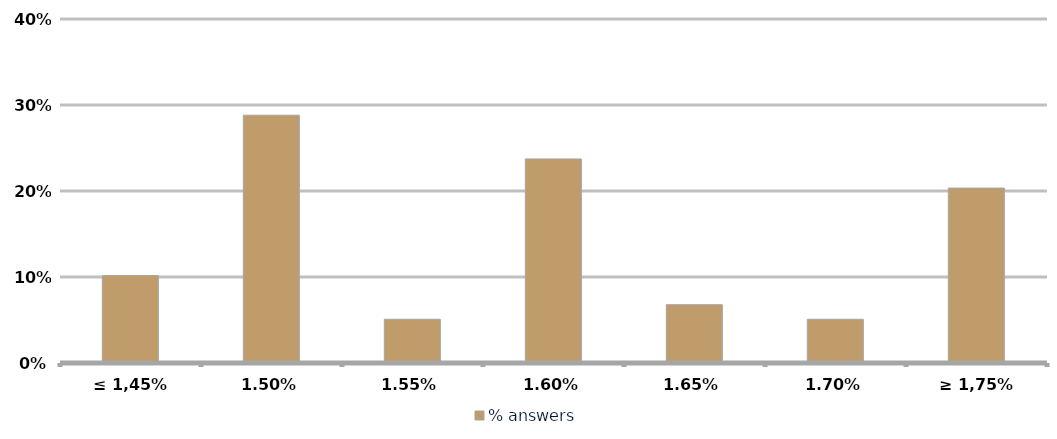
| Category | % answers |
|---|---|
| ≤ 1,45% | 0.102 |
| 1,50% | 0.288 |
| 1,55% | 0.051 |
| 1,60% | 0.237 |
| 1,65% | 0.068 |
| 1,70% | 0.051 |
| ≥ 1,75% | 0.203 |